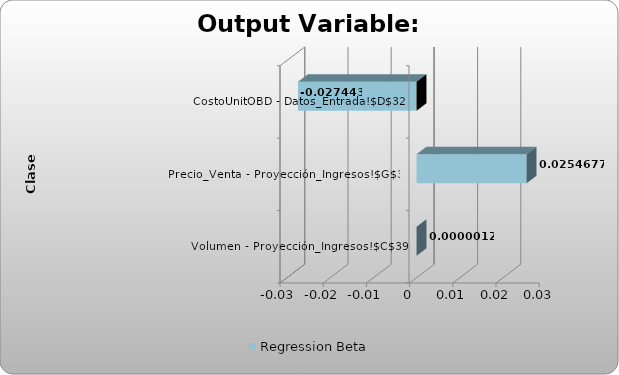
| Category | Regression Beta |
|---|---|
| Volumen - Proyección_Ingresos!$C$39 | 0 |
| Precio_Venta - Proyección_Ingresos!$G$39 | 0.025 |
| CostoUnitOBD - Datos_Entrada!$D$32 | -0.027 |